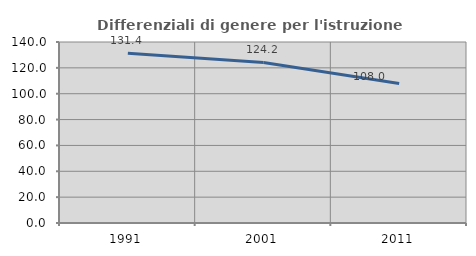
| Category | Differenziali di genere per l'istruzione superiore |
|---|---|
| 1991.0 | 131.357 |
| 2001.0 | 124.207 |
| 2011.0 | 107.951 |